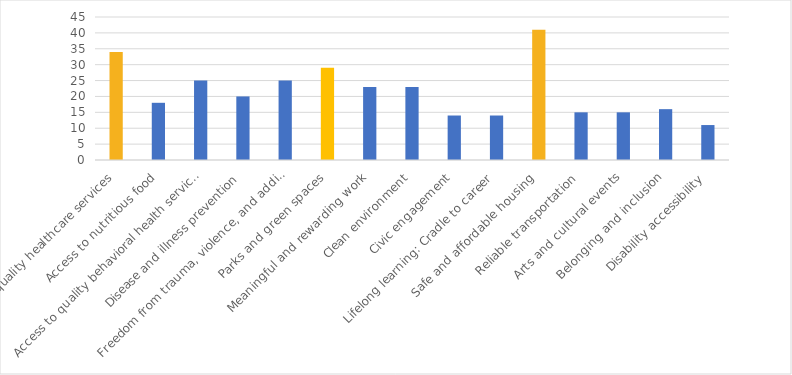
| Category | Number of Responses |
|---|---|
| Access to quality healthcare services | 34 |
| Access to nutritious food | 18 |
| Access to quality behavioral health services | 25 |
| Disease and illness prevention | 20 |
| Freedom from trauma, violence, and addiction | 25 |
| Parks and green spaces | 29 |
| Meaningful and rewarding work | 23 |
| Clean environment | 23 |
| Civic engagement | 14 |
| Lifelong learning: Cradle to career | 14 |
| Safe and affordable housing | 41 |
| Reliable transportation | 15 |
| Arts and cultural events | 15 |
| Belonging and inclusion | 16 |
| Disability accessibility | 11 |